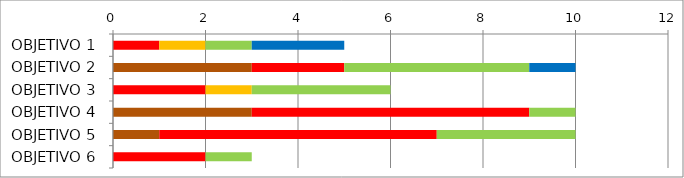
| Category | Series 0 | Series 1 | Series 2 | Series 3 | Series 4 | Series 5 |
|---|---|---|---|---|---|---|
| OBJETIVO 1 | 0 | 0 | 1 | 1 | 1 | 2 |
| OBJETIVO 2 | 3 | 0 | 2 | 0 | 4 | 1 |
| OBJETIVO 3 | 0 | 0 | 2 | 1 | 3 | 0 |
| OBJETIVO 4 | 3 | 0 | 6 | 0 | 1 | 0 |
| OBJETIVO 5 | 1 | 0 | 6 | 0 | 3 | 0 |
| OBJETIVO 6 | 0 | 0 | 2 | 0 | 1 | 0 |